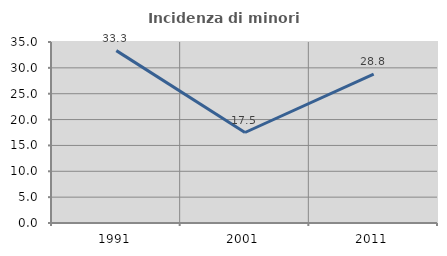
| Category | Incidenza di minori stranieri |
|---|---|
| 1991.0 | 33.333 |
| 2001.0 | 17.5 |
| 2011.0 | 28.807 |